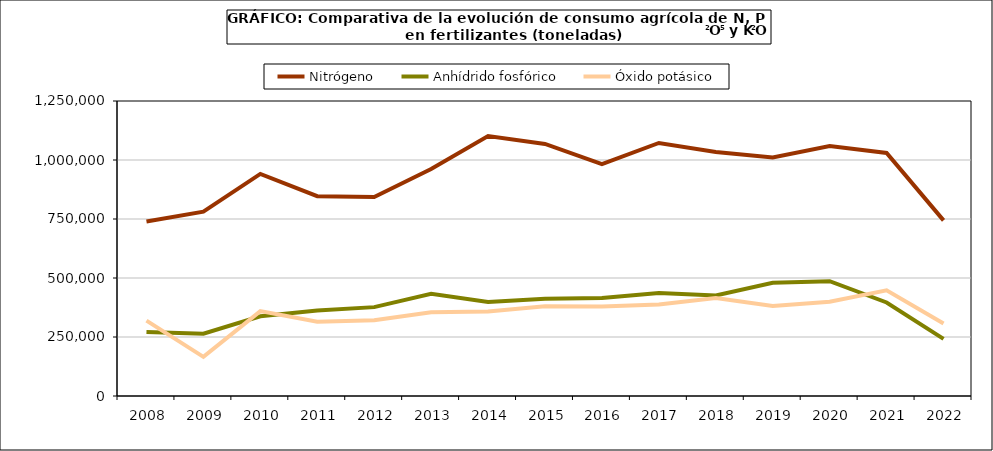
| Category | Nitrógeno | Anhídrido fosfórico | Óxido potásico |
|---|---|---|---|
|   2008 | 739757 | 271578 | 319194 |
|   2009 | 781069 | 264211 | 166016 |
|   2010 | 940984 | 337812 | 359583 |
|   2011 | 846697 | 362672 | 314642 |
|   2012 | 843410 | 376590 | 320841 |
|   2013 | 961507 | 432904 | 354738 |
|   2014 | 1101895 | 398580 | 357875 |
|   2015 | 1068103 | 411763 | 380303 |
|   2016 | 982155 | 414974 | 379007 |
|   2017 | 1072125 | 436110 | 387885 |
|   2018 | 1033494 | 425960 | 414675 |
|   2019 | 1010578 | 479562 | 381566 |
|   2020 | 1059299 | 486618 | 399379 |
|   2021 | 1029913 | 396291 | 447846 |
|   2022 | 744072.701 | 242114.949 | 306818.627 |